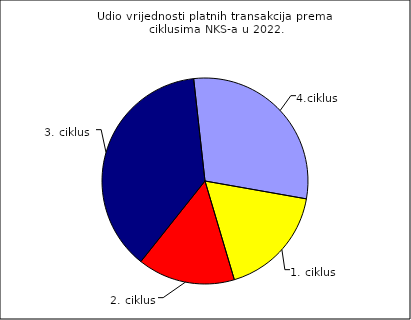
| Category | Series 0 |
|---|---|
| 1. ciklus | 0.176 |
| 2. ciklus | 0.153 |
| 3. ciklus | 0.375 |
| 4. ciklus | 0.295 |